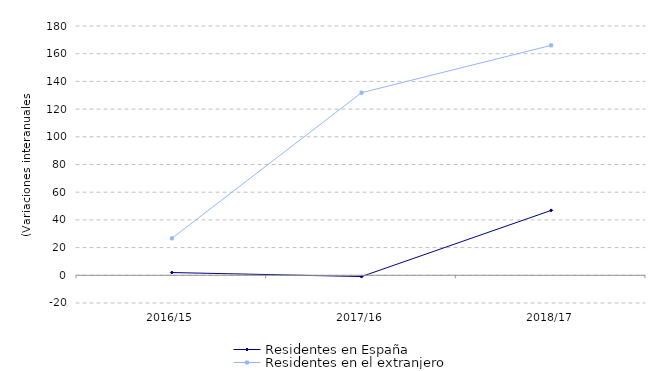
| Category | Residentes en España | Residentes en el extranjero |
|---|---|---|
| 2016/15 | 1.988 | 26.651 |
| 2017/16 | -0.91 | 131.835 |
| 2018/17 | 46.861 | 166.02 |